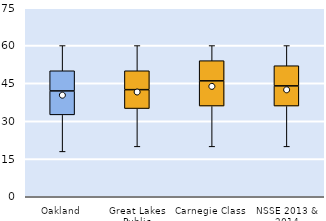
| Category | 25th | 50th | 75th |
|---|---|---|---|
| Oakland | 32.5 | 9.5 | 8 |
| Great Lakes Public | 35 | 7.5 | 7.5 |
| Carnegie Class | 36 | 10 | 8 |
| NSSE 2013 & 2014 | 36 | 8 | 8 |